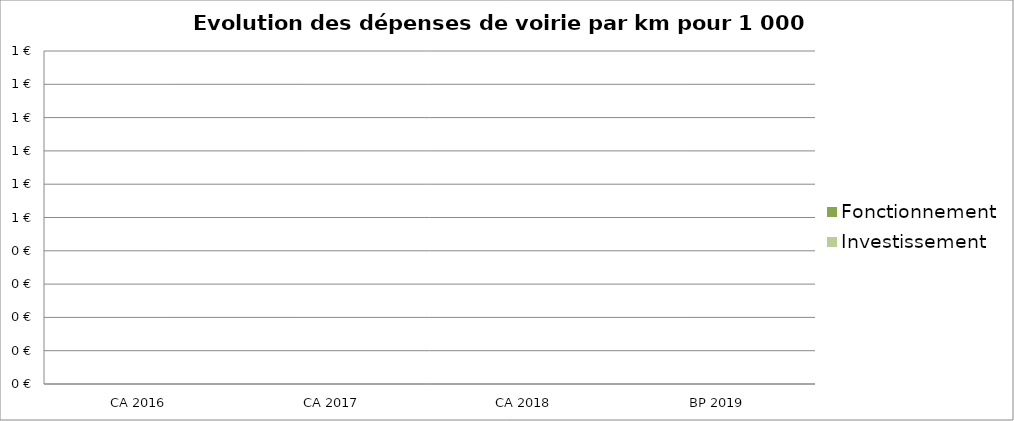
| Category | Fonctionnement | Investissement  |
|---|---|---|
| CA 2016 | 0 | 0 |
| CA 2017 | 0 | 0 |
| CA 2018 | 0 | 0 |
| BP 2019 | 0 | 0 |